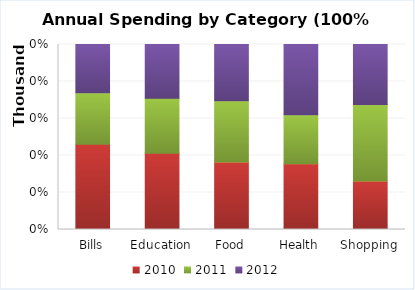
| Category | 2010 | 2011 | 2012 |
|---|---|---|---|
| Bills | 3785.581 | 2291.988 | 2145.344 |
| Education | 5893.992 | 4242.892 | 4150.561 |
| Food | 11655.463 | 10520.331 | 9714.334 |
| Health | 3379.324 | 2504.892 | 3607.436 |
| Shopping | 4075.61 | 6415.392 | 5046.717 |